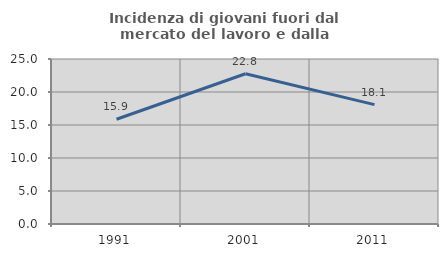
| Category | Incidenza di giovani fuori dal mercato del lavoro e dalla formazione  |
|---|---|
| 1991.0 | 15.871 |
| 2001.0 | 22.766 |
| 2011.0 | 18.092 |